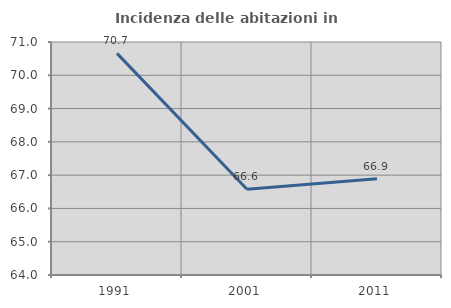
| Category | Incidenza delle abitazioni in proprietà  |
|---|---|
| 1991.0 | 70.659 |
| 2001.0 | 66.576 |
| 2011.0 | 66.894 |